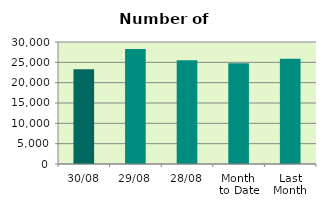
| Category | Series 0 |
|---|---|
| 30/08 | 23318 |
| 29/08 | 28268 |
| 28/08 | 25496 |
| Month 
to Date | 24762.364 |
| Last
Month | 25883.727 |